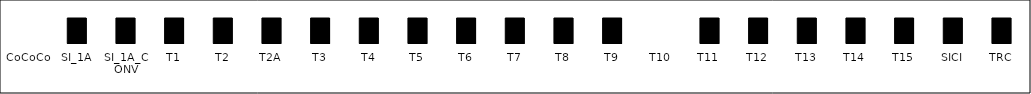
| Category | Series 0 |
|---|---|
| CoCoCo | 0 |
| SI_1A | 1 |
| SI_1A_CONV | 1 |
| T1 | 1 |
| T2 | 1 |
| T2A | 1 |
| T3 | 1 |
| T4 | 1 |
| T5 | 1 |
| T6 | 1 |
| T7 | 1 |
| T8 | 1 |
| T9 | 1 |
| T10 | 0 |
| T11 | 1 |
| T12 | 1 |
| T13 | 1 |
| T14 | 1 |
| T15 | 1 |
| SICI | 1 |
| TRC | 1 |